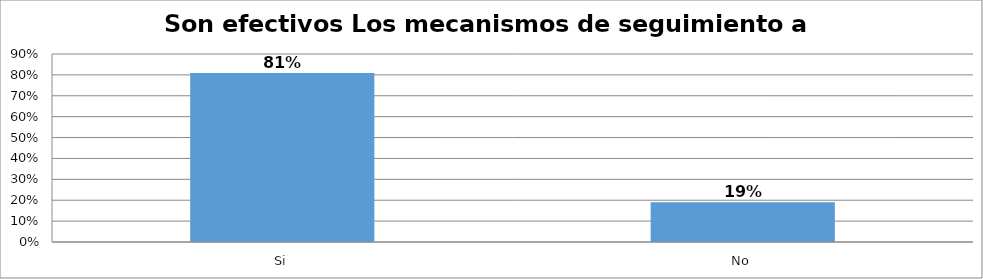
| Category | Series 0 |
|---|---|
| Si | 0.81 |
| No | 0.19 |